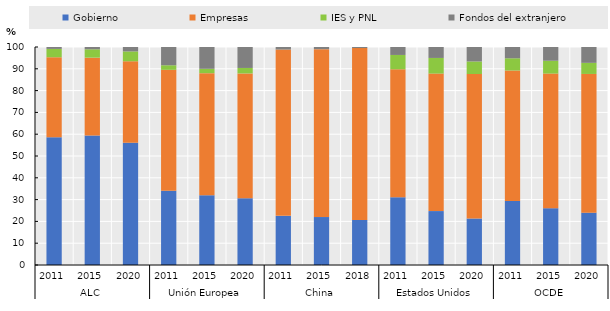
| Category | Gobierno | Empresas | IES y PNL | Fondos del extranjero |
|---|---|---|---|---|
| 0 | 58.651 | 36.657 | 3.812 | 0.88 |
| 1 | 59.445 | 35.667 | 3.831 | 1.057 |
| 2 | 56.075 | 37.383 | 4.517 | 2.025 |
| 3 | 34.031 | 55.497 | 2.094 | 8.377 |
| 4 | 32 | 56 | 2 | 10 |
| 5 | 30.664 | 57.208 | 2.517 | 9.611 |
| 6 | 22.543 | 76.301 | 0 | 1.156 |
| 7 | 22 | 77 | 0 | 1 |
| 8 | 20.673 | 78.846 | 0 | 0.481 |
| 9 | 31.022 | 58.759 | 6.569 | 3.65 |
| 10 | 24.731 | 63.082 | 7.168 | 5.018 |
| 11 | 21.326 | 66.282 | 5.764 | 6.628 |
| 12 | 29.31 | 59.914 | 5.603 | 5.172 |
| 13 | 26.05 | 61.765 | 5.882 | 6.303 |
| 14 | 24 | 63.636 | 5.091 | 7.273 |